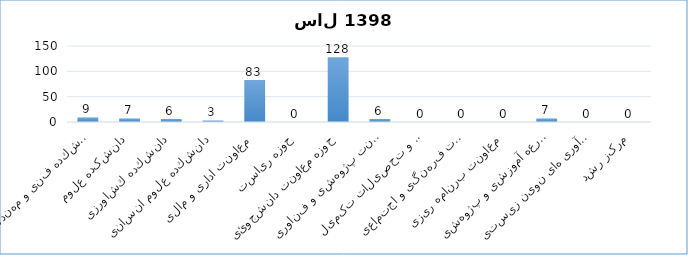
| Category | جمع کل |
|---|---|
| دانشكده فنی و مهندسی | 9 |
| دانشکده علوم | 7 |
| دانشكده كشاورزی | 6 |
| دانشكده علوم انسانی | 3 |
| معاونت اداری و مالی | 83 |
| حوزه ریاست | 0 |
| حوزه معاونت دانشجوئی | 128 |
| معاونت پژوهشی و فناوری | 6 |
| معاونت آموزشی و تحصیلات تکمیلی | 0 |
| حوزه معاونت فرهنگی و اجتماعی | 0 |
| معاونت برنامه ریزی | 0 |
| مزرعه آموزشی و پژوهشی | 7 |
| پژو هشکده فنآوری های نوین زیستی | 0 |
| مرکز رشد | 0 |